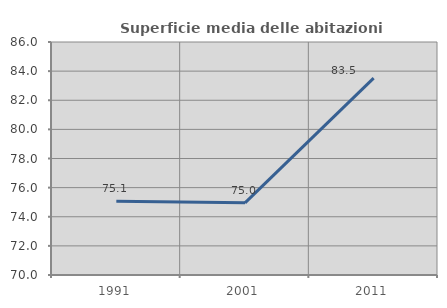
| Category | Superficie media delle abitazioni occupate |
|---|---|
| 1991.0 | 75.068 |
| 2001.0 | 74.957 |
| 2011.0 | 83.516 |